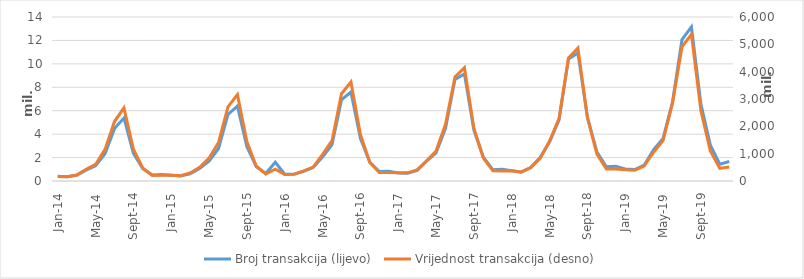
| Category | Broj transakcija (lijevo) |
|---|---|
| sij.14 | 397343 |
| vlj.14 | 361078 |
| ožu.14 | 493145 |
| tra.14 | 934003 |
| svi.14 | 1295388 |
| lip.14 | 2322493 |
| srp.14 | 4472930 |
| kol.14 | 5380145 |
| ruj.14 | 2354410 |
| lis.14 | 1061057 |
| stu.14 | 515074 |
| pro.14 | 552008 |
| sij.15 | 487873 |
| vlj.15 | 434472 |
| ožu.15 | 618192 |
| tra.15 | 1071368 |
| svi.15 | 1684681 |
| lip.15 | 2777989 |
| srp.15 | 5680159 |
| kol.15 | 6394748 |
| ruj.15 | 2918051 |
| lis.15 | 1209535 |
| stu.15 | 648645 |
| pro.15 | 1601674 |
| sij.16 | 584292 |
| vlj.16 | 574917 |
| ožu.16 | 823749 |
| tra.16 | 1149524 |
| svi.16 | 2038066 |
| lip.16 | 3106484 |
| srp.16 | 6928007 |
| kol.16 | 7595443 |
| ruj.16 | 3649461 |
| lis.16 | 1590986 |
| stu.16 | 802784 |
| pro.16 | 832600 |
| sij.17 | 684062 |
| vlj.17 | 667841 |
| ožu.17 | 903419 |
| tra.17 | 1701419 |
| svi.17 | 2408336 |
| lip.17 | 4486057 |
| srp.17 | 8663549 |
| kol.17 | 9142665 |
| ruj.17 | 4345036 |
| lis.17 | 2028244 |
| stu.17 | 958090 |
| pro.17 | 1004475 |
| sij.18 | 877554 |
| vlj. 18 | 761371 |
| ožu.18 | 1143138 |
| tra.18 | 1996709 |
| svi.18 | 3328942 |
| lip.18 | 5198448 |
| srp.18 | 10409271 |
| kol.18 | 10932790 |
| ruj.18 | 5457745 |
| lis.18 | 2502920 |
| stu.18 | 1207090 |
| pro.18 | 1267869 |
| sij.19 | 1030317 |
| vlj. 19 | 978277 |
| ožu.19 | 1348516 |
| tra.19 | 2678504 |
| svi.19 | 3636139 |
| lip.19 | 6740954 |
| srp.19 | 12076123 |
| kol.19 | 13149487 |
| ruj.19 | 6567510 |
| lis.19 | 3056294 |
| stu.19 | 1430865 |
| pro.19 | 1661546 |